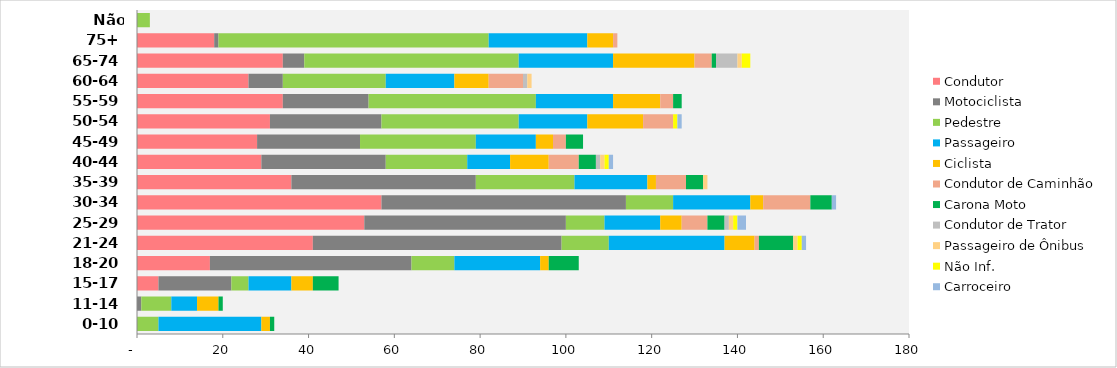
| Category | Condutor | Motociclista | Pedestre | Passageiro | Ciclista | Condutor de Caminhão | Carona Moto | Condutor de Trator | Passageiro de Ônibus | Não Inf. | Carroceiro |
|---|---|---|---|---|---|---|---|---|---|---|---|
| 0-10 | 0 | 0 | 5 | 24 | 2 | 0 | 1 | 0 | 0 | 0 | 0 |
| 11-14 | 0 | 1 | 7 | 6 | 5 | 0 | 1 | 0 | 0 | 0 | 0 |
| 15-17 | 5 | 17 | 4 | 10 | 5 | 0 | 6 | 0 | 0 | 0 | 0 |
| 18-20 | 17 | 47 | 10 | 20 | 2 | 0 | 7 | 0 | 0 | 0 | 0 |
| 21-24 | 41 | 58 | 11 | 27 | 7 | 1 | 8 | 0 | 1 | 1 | 1 |
| 25-29 | 53 | 47 | 9 | 13 | 5 | 6 | 4 | 1 | 1 | 1 | 2 |
| 30-34 | 57 | 57 | 11 | 18 | 3 | 11 | 5 | 0 | 0 | 0 | 1 |
| 35-39 | 36 | 43 | 23 | 17 | 2 | 7 | 4 | 0 | 1 | 0 | 0 |
| 40-44 | 29 | 29 | 19 | 10 | 9 | 7 | 4 | 1 | 1 | 1 | 1 |
| 45-49 | 28 | 24 | 27 | 14 | 4 | 3 | 4 | 0 | 0 | 0 | 0 |
| 50-54 | 31 | 26 | 32 | 16 | 13 | 7 | 0 | 0 | 0 | 1 | 1 |
| 55-59 | 34 | 20 | 39 | 18 | 11 | 3 | 2 | 0 | 0 | 0 | 0 |
| 60-64 | 26 | 8 | 24 | 16 | 8 | 8 | 0 | 1 | 1 | 0 | 0 |
| 65-74 | 34 | 5 | 50 | 22 | 19 | 4 | 1 | 5 | 1 | 2 | 0 |
| 75+ | 18 | 1 | 63 | 23 | 6 | 1 | 0 | 0 | 0 | 0 | 0 |
| Não informado | 0 | 0 | 3 | 0 | 0 | 0 | 0 | 0 | 0 | 0 | 0 |